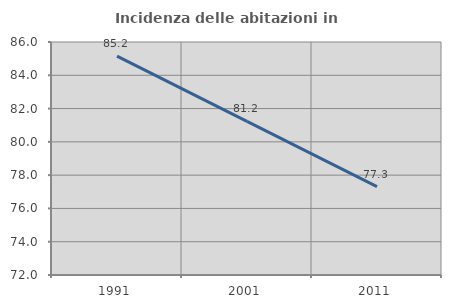
| Category | Incidenza delle abitazioni in proprietà  |
|---|---|
| 1991.0 | 85.151 |
| 2001.0 | 81.226 |
| 2011.0 | 77.306 |